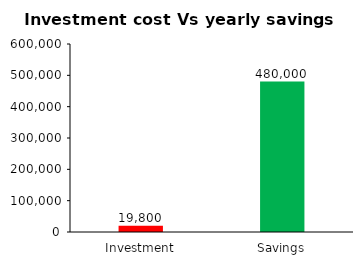
| Category | Series 0 |
|---|---|
| Investment | 19800 |
| Savings | 480000 |